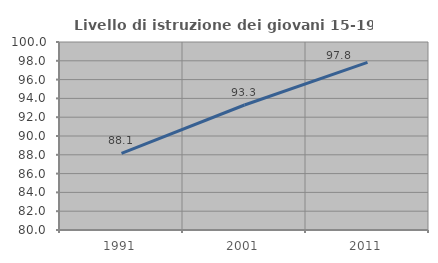
| Category | Livello di istruzione dei giovani 15-19 anni |
|---|---|
| 1991.0 | 88.142 |
| 2001.0 | 93.296 |
| 2011.0 | 97.826 |